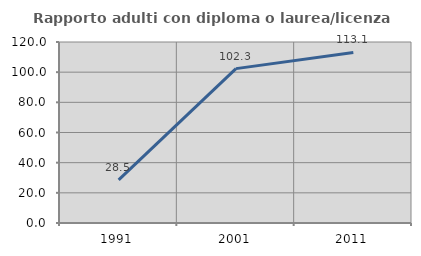
| Category | Rapporto adulti con diploma o laurea/licenza media  |
|---|---|
| 1991.0 | 28.534 |
| 2001.0 | 102.342 |
| 2011.0 | 113.078 |